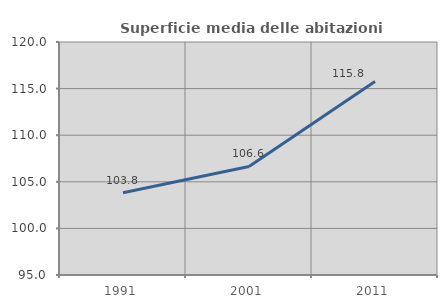
| Category | Superficie media delle abitazioni occupate |
|---|---|
| 1991.0 | 103.818 |
| 2001.0 | 106.647 |
| 2011.0 | 115.766 |